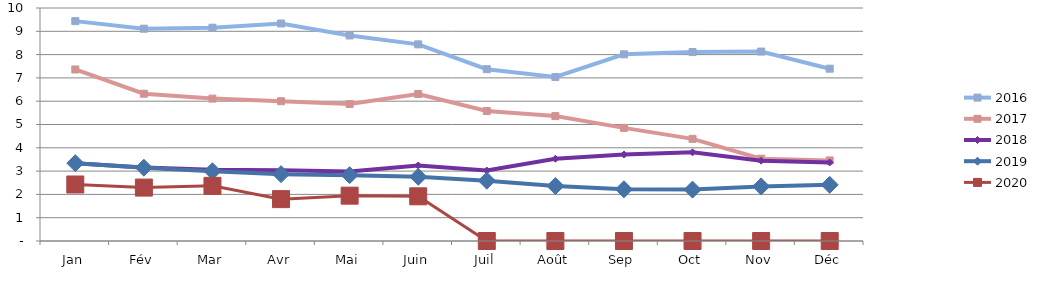
| Category | 2015 | 2016 | 2017 | 2018 | 2019 | 2020 |
|---|---|---|---|---|---|---|
| Jan |  | 9.436 | 7.361 | 3.34 | 3.341 | 2.425 |
| Fév |  | 9.111 | 6.321 | 3.159 | 3.145 | 2.293 |
| Mar |  | 9.154 | 6.111 | 3.062 | 2.994 | 2.366 |
| Avr |  | 9.335 | 5.999 | 3.031 | 2.87 | 1.797 |
| Mai |  | 8.821 | 5.878 | 2.984 | 2.827 | 1.946 |
| Juin |  | 8.439 | 6.309 | 3.242 | 2.755 | 1.918 |
| Juil |  | 7.373 | 5.577 | 3.025 | 2.589 | 0 |
| Août |  | 7.04 | 5.36 | 3.53 | 2.359 | 0 |
| Sep |  | 8.012 | 4.855 | 3.712 | 2.22 | 0 |
| Oct |  | 8.109 | 4.384 | 3.806 | 2.206 | 0 |
| Nov |  | 8.13 | 3.533 | 3.449 | 2.343 | 0 |
| Déc |  | 7.395 | 3.458 | 3.371 | 2.411 | 0 |